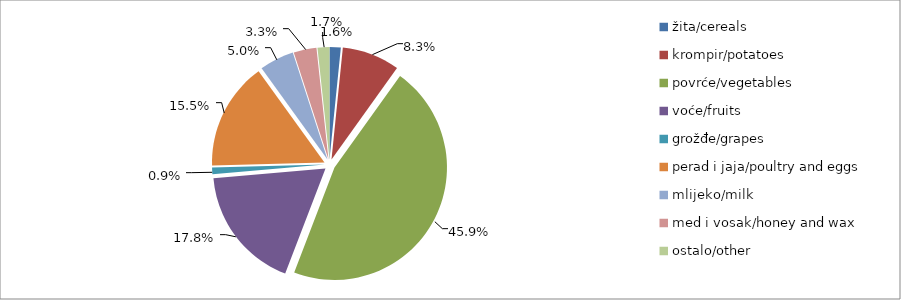
| Category | Series 0 |
|---|---|
| žita/cereals | 20478 |
| krompir/potatoes | 105276 |
| povrće/vegetables | 583865.5 |
| voće/fruits | 226086 |
| grožđe/grapes | 11940 |
| perad i jaja/poultry and eggs | 196736 |
| mlijeko/milk | 63171 |
| med i vosak/honey and wax | 41740 |
| ostalo/other | 21720 |